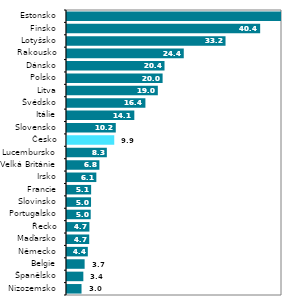
| Category | Series 0 |
|---|---|
| Nizozemsko | 3.04 |
| Španělsko | 3.42 |
| Belgie | 3.69 |
| Německo | 4.36 |
| Maďarsko | 4.65 |
| Řecko | 4.69 |
| Portugalsko | 4.96 |
| Slovinsko | 5.03 |
| Francie | 5.05 |
| Irsko | 6.14 |
| Velká Británie | 6.78 |
| Lucembursko | 8.34 |
| Česko | 9.89 |
| Slovensko | 10.21 |
| Itálie | 14.09 |
| Švédsko | 16.41 |
| Litva | 19.01 |
| Polsko | 20.01 |
| Dánsko | 20.41 |
| Rakousko | 24.44 |
| Lotyšsko | 33.18 |
| Finsko | 40.43 |
| Estonsko | 61.33 |